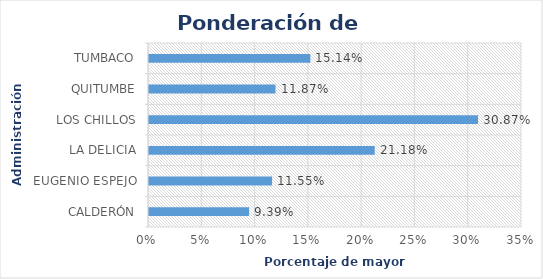
| Category | Series 0 |
|---|---|
| CALDERÓN | 0.094 |
| EUGENIO ESPEJO | 0.116 |
| LA DELICIA | 0.212 |
| LOS CHILLOS | 0.309 |
| QUITUMBE | 0.119 |
| TUMBACO | 0.151 |